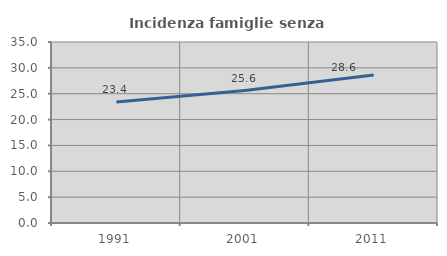
| Category | Incidenza famiglie senza nuclei |
|---|---|
| 1991.0 | 23.383 |
| 2001.0 | 25.604 |
| 2011.0 | 28.636 |